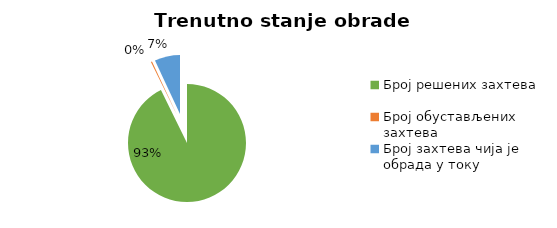
| Category | Series 0 |
|---|---|
| Број решених захтева | 30006 |
| Број обустављених захтева | 99 |
| Број захтева чија је обрада у току | 2257 |